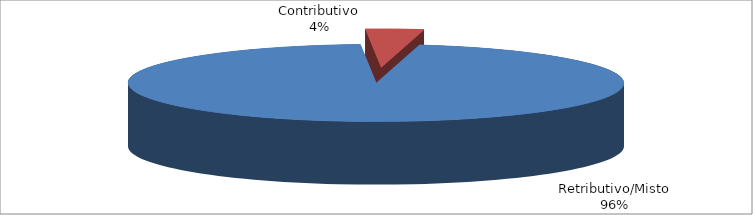
| Category | Decorrenti ANNO 2021 |
|---|---|
| Retributivo/Misto | 82276 |
| Contributivo | 3243 |